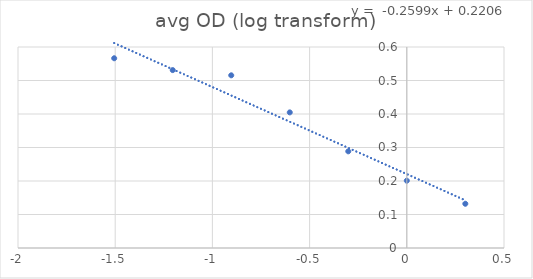
| Category | Series 0 |
|---|---|
| -1.505149978319906 | 0.566 |
| -1.2041199826559248 | 0.531 |
| -0.9030899869919435 | 0.516 |
| -0.6020599913279624 | 0.405 |
| -0.3010299956639812 | 0.289 |
| 0.0 | 0.201 |
| 0.3010299956639812 | 0.132 |